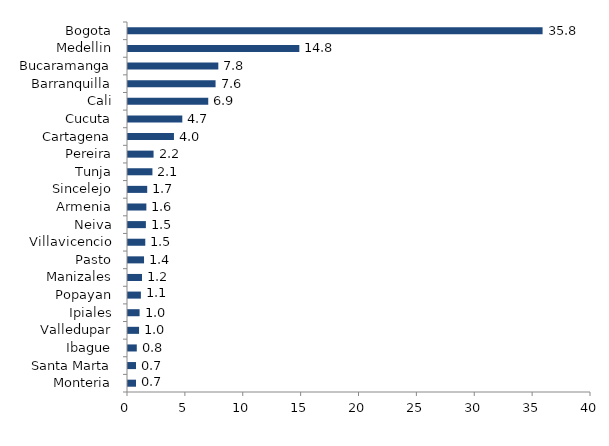
| Category | Series 0 |
|---|---|
| Monteria | 0.692 |
| Santa Marta | 0.693 |
| Ibague | 0.759 |
| Valledupar | 0.955 |
| Ipiales | 1.001 |
| Popayan | 1.114 |
| Manizales | 1.212 |
| Pasto | 1.386 |
| Villavicencio | 1.493 |
| Neiva | 1.545 |
| Armenia | 1.586 |
| Sincelejo | 1.661 |
| Tunja | 2.111 |
| Pereira | 2.209 |
| Cartagena | 3.971 |
| Cucuta | 4.692 |
| Cali | 6.932 |
| Barranquilla | 7.565 |
| Bucaramanga | 7.803 |
| Medellin | 14.803 |
| Bogota | 35.817 |